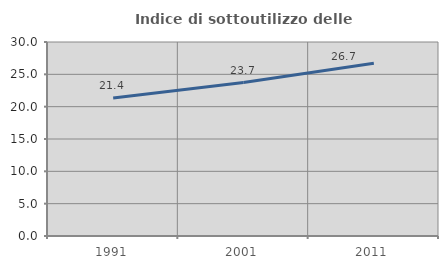
| Category | Indice di sottoutilizzo delle abitazioni  |
|---|---|
| 1991.0 | 21.352 |
| 2001.0 | 23.726 |
| 2011.0 | 26.714 |